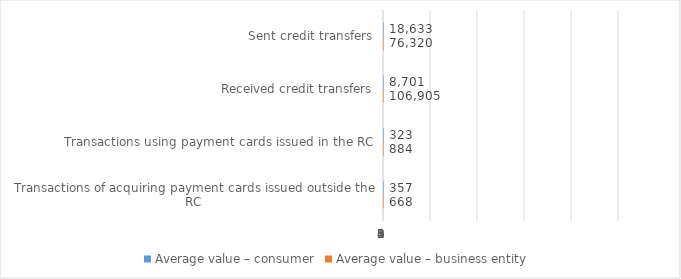
| Category | Average value – consumer | Average value – business entity  |
|---|---|---|
| Sent credit transfers | 18632.997 | 76319.98 |
| Received credit transfers | 8701.157 | 106905.299 |
| Transactions using payment cards issued in the RC | 322.998 | 883.763 |
| Transactions of acquiring payment cards issued outside the RC | 356.76 | 668.244 |